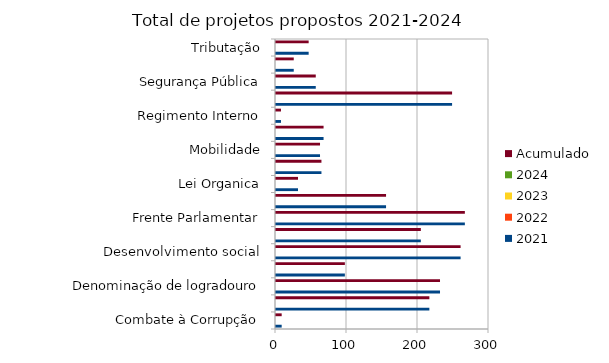
| Category | 2021 | 2022 | 2023 | 2024 | Acumulado |
|---|---|---|---|---|---|
| Combate à Corrupção | 8 |  |  |  | 8 |
| Datas comemorativas e homenagens diversas | 216 |  |  |  | 216 |
| Denominação de logradouro | 231 |  |  |  | 231 |
| Desenvolvimento economico | 97 |  |  |  | 97 |
| Desenvolvimento social | 260 |  |  |  | 260 |
| Educação e cultura | 204 |  |  |  | 204 |
| Frente Parlamentar | 266 |  |  |  | 266 |
| Habit. E Urbanismo | 155 |  |  |  | 155 |
| Lei Organica | 31 |  |  |  | 31 |
| Meio Ambiente | 64 |  |  |  | 64 |
| Mobilidade | 62 |  |  |  | 62 |
| Proteção Animais | 67 |  |  |  | 67 |
| Regimento Interno | 7 |  |  |  | 7 |
| Saúde e Esporte | 248 |  |  |  | 248 |
| Segurança Pública | 56 |  |  |  | 56 |
| Transparência | 25 |  |  |  | 25 |
| Tributação | 46 |  |  |  | 46 |